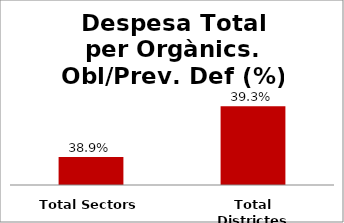
| Category | Series 0 |
|---|---|
| Total Sectors | 0.389 |
| Total Districtes | 0.393 |